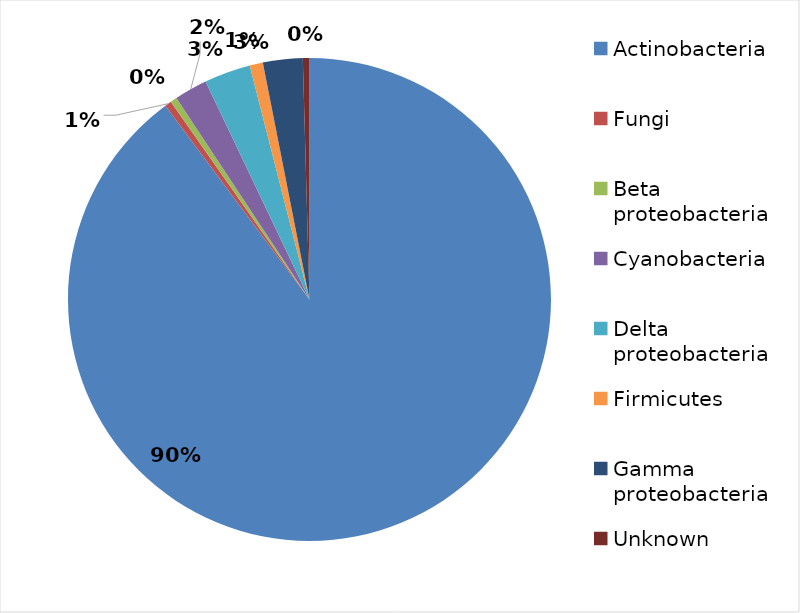
| Category | Series 0 |
|---|---|
| Actinobacteria | 203 |
| Fungi | 1 |
| Beta proteobacteria | 1 |
| Cyanobacteria | 5 |
| Delta proteobacteria | 7 |
| Firmicutes | 2 |
| Gamma proteobacteria | 6 |
| Unknown | 1 |